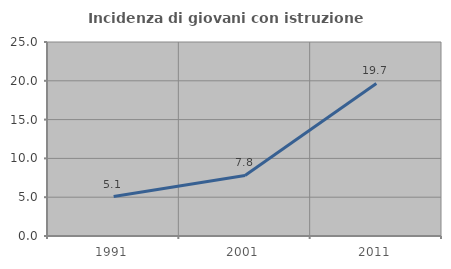
| Category | Incidenza di giovani con istruzione universitaria |
|---|---|
| 1991.0 | 5.085 |
| 2001.0 | 7.798 |
| 2011.0 | 19.653 |